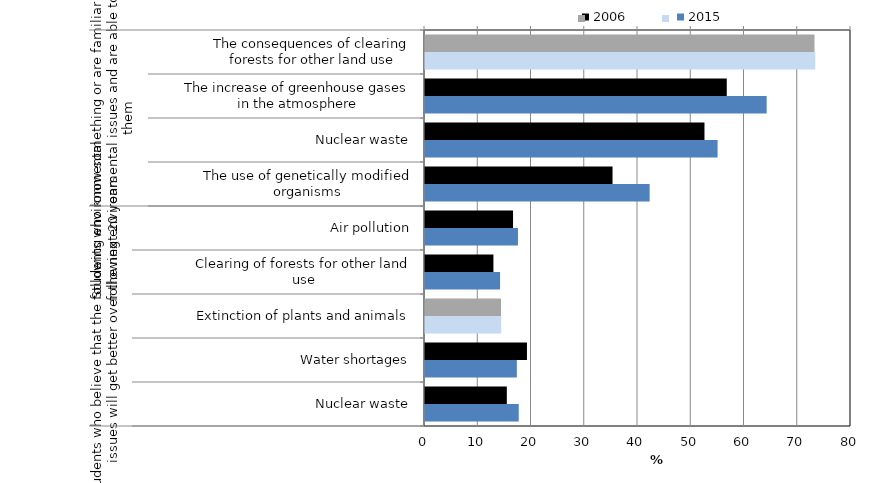
| Category | 2006 | 2015 |
|---|---|---|
| 0 | 73.147 | 73.29 |
| 1 | 56.67 | 64.164 |
| 2 | 52.483 | 54.945 |
| 3 | 35.221 | 42.188 |
| 4 | 16.535 | 17.455 |
| 5 | 12.849 | 14.099 |
| 6 | 14.272 | 14.309 |
| 7 | 19.144 | 17.248 |
| 8 | 15.364 | 17.604 |